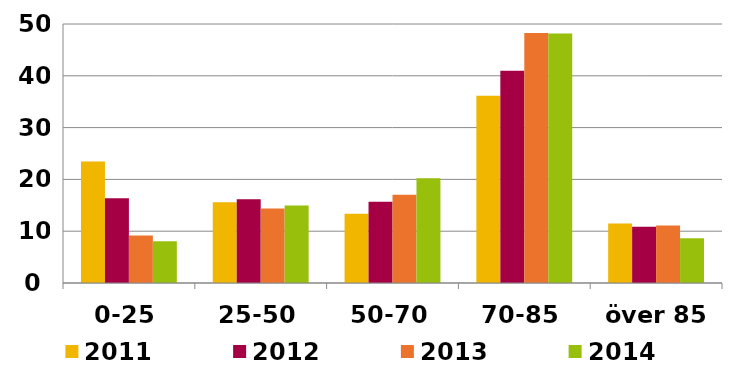
| Category | 2011 | 2012 | 2013 | 2014 |
|---|---|---|---|---|
| 0-25 | 23.433 | 16.345 | 9.191 | 8.053 |
| 25-50 | 15.584 | 16.152 | 14.4 | 14.964 |
| 50-70 | 13.356 | 15.672 | 17.05 | 20.216 |
| 70-85 | 36.144 | 40.967 | 48.266 | 48.143 |
| över 85 | 11.482 | 10.864 | 11.094 | 8.623 |